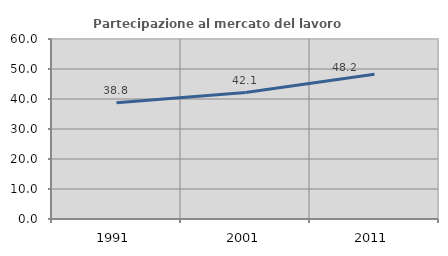
| Category | Partecipazione al mercato del lavoro  femminile |
|---|---|
| 1991.0 | 38.755 |
| 2001.0 | 42.143 |
| 2011.0 | 48.25 |